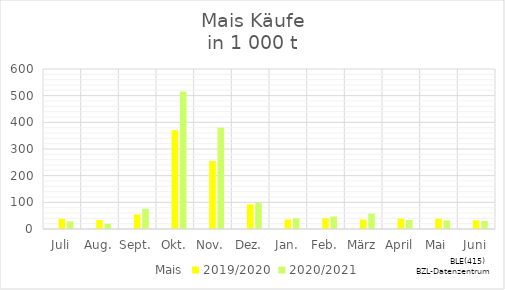
| Category | Mais | 2019/2020 | 2020/2021 |
|---|---|---|---|
| Juli |  | 38.583 | 28.451 |
| Aug. |  | 33.504 | 19.53 |
| Sept. |  | 54.793 | 75.654 |
| Okt. |  | 370.392 | 515.587 |
| Nov. |  | 255.301 | 379.979 |
| Dez. |  | 92.52 | 98.06 |
| Jan. |  | 35.883 | 40.181 |
| Feb. |  | 40.083 | 47.069 |
| März |  | 35.668 | 57.347 |
| April |  | 38.945 | 33.736 |
| Mai |  | 38.527 | 32.204 |
| Juni |  | 32.295 | 30.103 |